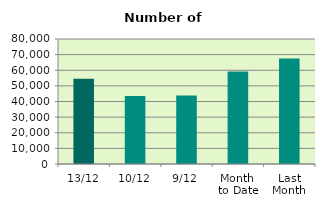
| Category | Series 0 |
|---|---|
| 13/12 | 54548 |
| 10/12 | 43478 |
| 9/12 | 43916 |
| Month 
to Date | 59155.778 |
| Last
Month | 67470.455 |